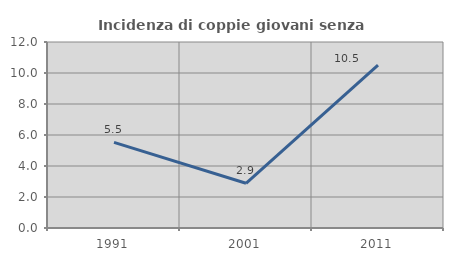
| Category | Incidenza di coppie giovani senza figli |
|---|---|
| 1991.0 | 5.521 |
| 2001.0 | 2.885 |
| 2011.0 | 10.506 |